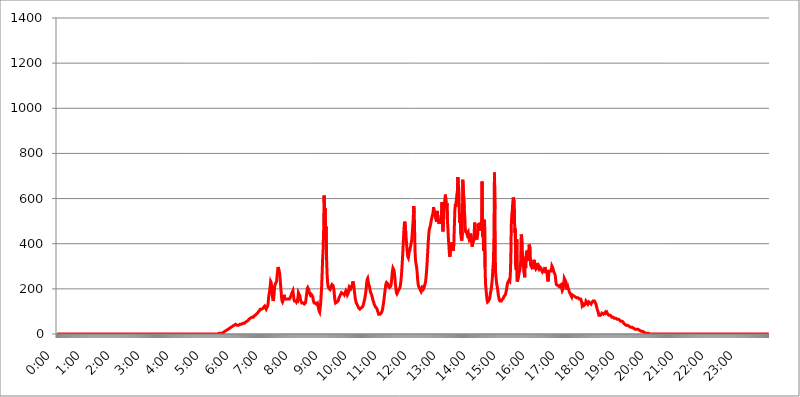
| Category | 2016.05.11. Intenzitás [W/m^2] |
|---|---|
| 0.0 | 0 |
| 0.0006944444444444445 | 0 |
| 0.001388888888888889 | 0 |
| 0.0020833333333333333 | 0 |
| 0.002777777777777778 | 0 |
| 0.003472222222222222 | 0 |
| 0.004166666666666667 | 0 |
| 0.004861111111111111 | 0 |
| 0.005555555555555556 | 0 |
| 0.0062499999999999995 | 0 |
| 0.006944444444444444 | 0 |
| 0.007638888888888889 | 0 |
| 0.008333333333333333 | 0 |
| 0.009027777777777779 | 0 |
| 0.009722222222222222 | 0 |
| 0.010416666666666666 | 0 |
| 0.011111111111111112 | 0 |
| 0.011805555555555555 | 0 |
| 0.012499999999999999 | 0 |
| 0.013194444444444444 | 0 |
| 0.013888888888888888 | 0 |
| 0.014583333333333332 | 0 |
| 0.015277777777777777 | 0 |
| 0.015972222222222224 | 0 |
| 0.016666666666666666 | 0 |
| 0.017361111111111112 | 0 |
| 0.018055555555555557 | 0 |
| 0.01875 | 0 |
| 0.019444444444444445 | 0 |
| 0.02013888888888889 | 0 |
| 0.020833333333333332 | 0 |
| 0.02152777777777778 | 0 |
| 0.022222222222222223 | 0 |
| 0.02291666666666667 | 0 |
| 0.02361111111111111 | 0 |
| 0.024305555555555556 | 0 |
| 0.024999999999999998 | 0 |
| 0.025694444444444447 | 0 |
| 0.02638888888888889 | 0 |
| 0.027083333333333334 | 0 |
| 0.027777777777777776 | 0 |
| 0.02847222222222222 | 0 |
| 0.029166666666666664 | 0 |
| 0.029861111111111113 | 0 |
| 0.030555555555555555 | 0 |
| 0.03125 | 0 |
| 0.03194444444444445 | 0 |
| 0.03263888888888889 | 0 |
| 0.03333333333333333 | 0 |
| 0.034027777777777775 | 0 |
| 0.034722222222222224 | 0 |
| 0.035416666666666666 | 0 |
| 0.036111111111111115 | 0 |
| 0.03680555555555556 | 0 |
| 0.0375 | 0 |
| 0.03819444444444444 | 0 |
| 0.03888888888888889 | 0 |
| 0.03958333333333333 | 0 |
| 0.04027777777777778 | 0 |
| 0.04097222222222222 | 0 |
| 0.041666666666666664 | 0 |
| 0.042361111111111106 | 0 |
| 0.04305555555555556 | 0 |
| 0.043750000000000004 | 0 |
| 0.044444444444444446 | 0 |
| 0.04513888888888889 | 0 |
| 0.04583333333333334 | 0 |
| 0.04652777777777778 | 0 |
| 0.04722222222222222 | 0 |
| 0.04791666666666666 | 0 |
| 0.04861111111111111 | 0 |
| 0.049305555555555554 | 0 |
| 0.049999999999999996 | 0 |
| 0.05069444444444445 | 0 |
| 0.051388888888888894 | 0 |
| 0.052083333333333336 | 0 |
| 0.05277777777777778 | 0 |
| 0.05347222222222222 | 0 |
| 0.05416666666666667 | 0 |
| 0.05486111111111111 | 0 |
| 0.05555555555555555 | 0 |
| 0.05625 | 0 |
| 0.05694444444444444 | 0 |
| 0.057638888888888885 | 0 |
| 0.05833333333333333 | 0 |
| 0.05902777777777778 | 0 |
| 0.059722222222222225 | 0 |
| 0.06041666666666667 | 0 |
| 0.061111111111111116 | 0 |
| 0.06180555555555556 | 0 |
| 0.0625 | 0 |
| 0.06319444444444444 | 0 |
| 0.06388888888888888 | 0 |
| 0.06458333333333334 | 0 |
| 0.06527777777777778 | 0 |
| 0.06597222222222222 | 0 |
| 0.06666666666666667 | 0 |
| 0.06736111111111111 | 0 |
| 0.06805555555555555 | 0 |
| 0.06874999999999999 | 0 |
| 0.06944444444444443 | 0 |
| 0.07013888888888889 | 0 |
| 0.07083333333333333 | 0 |
| 0.07152777777777779 | 0 |
| 0.07222222222222223 | 0 |
| 0.07291666666666667 | 0 |
| 0.07361111111111111 | 0 |
| 0.07430555555555556 | 0 |
| 0.075 | 0 |
| 0.07569444444444444 | 0 |
| 0.0763888888888889 | 0 |
| 0.07708333333333334 | 0 |
| 0.07777777777777778 | 0 |
| 0.07847222222222222 | 0 |
| 0.07916666666666666 | 0 |
| 0.0798611111111111 | 0 |
| 0.08055555555555556 | 0 |
| 0.08125 | 0 |
| 0.08194444444444444 | 0 |
| 0.08263888888888889 | 0 |
| 0.08333333333333333 | 0 |
| 0.08402777777777777 | 0 |
| 0.08472222222222221 | 0 |
| 0.08541666666666665 | 0 |
| 0.08611111111111112 | 0 |
| 0.08680555555555557 | 0 |
| 0.08750000000000001 | 0 |
| 0.08819444444444445 | 0 |
| 0.08888888888888889 | 0 |
| 0.08958333333333333 | 0 |
| 0.09027777777777778 | 0 |
| 0.09097222222222222 | 0 |
| 0.09166666666666667 | 0 |
| 0.09236111111111112 | 0 |
| 0.09305555555555556 | 0 |
| 0.09375 | 0 |
| 0.09444444444444444 | 0 |
| 0.09513888888888888 | 0 |
| 0.09583333333333333 | 0 |
| 0.09652777777777777 | 0 |
| 0.09722222222222222 | 0 |
| 0.09791666666666667 | 0 |
| 0.09861111111111111 | 0 |
| 0.09930555555555555 | 0 |
| 0.09999999999999999 | 0 |
| 0.10069444444444443 | 0 |
| 0.1013888888888889 | 0 |
| 0.10208333333333335 | 0 |
| 0.10277777777777779 | 0 |
| 0.10347222222222223 | 0 |
| 0.10416666666666667 | 0 |
| 0.10486111111111111 | 0 |
| 0.10555555555555556 | 0 |
| 0.10625 | 0 |
| 0.10694444444444444 | 0 |
| 0.1076388888888889 | 0 |
| 0.10833333333333334 | 0 |
| 0.10902777777777778 | 0 |
| 0.10972222222222222 | 0 |
| 0.1111111111111111 | 0 |
| 0.11180555555555556 | 0 |
| 0.11180555555555556 | 0 |
| 0.1125 | 0 |
| 0.11319444444444444 | 0 |
| 0.11388888888888889 | 0 |
| 0.11458333333333333 | 0 |
| 0.11527777777777777 | 0 |
| 0.11597222222222221 | 0 |
| 0.11666666666666665 | 0 |
| 0.1173611111111111 | 0 |
| 0.11805555555555557 | 0 |
| 0.11944444444444445 | 0 |
| 0.12013888888888889 | 0 |
| 0.12083333333333333 | 0 |
| 0.12152777777777778 | 0 |
| 0.12222222222222223 | 0 |
| 0.12291666666666667 | 0 |
| 0.12291666666666667 | 0 |
| 0.12361111111111112 | 0 |
| 0.12430555555555556 | 0 |
| 0.125 | 0 |
| 0.12569444444444444 | 0 |
| 0.12638888888888888 | 0 |
| 0.12708333333333333 | 0 |
| 0.16875 | 0 |
| 0.12847222222222224 | 0 |
| 0.12916666666666668 | 0 |
| 0.12986111111111112 | 0 |
| 0.13055555555555556 | 0 |
| 0.13125 | 0 |
| 0.13194444444444445 | 0 |
| 0.1326388888888889 | 0 |
| 0.13333333333333333 | 0 |
| 0.13402777777777777 | 0 |
| 0.13402777777777777 | 0 |
| 0.13472222222222222 | 0 |
| 0.13541666666666666 | 0 |
| 0.1361111111111111 | 0 |
| 0.13749999999999998 | 0 |
| 0.13819444444444443 | 0 |
| 0.1388888888888889 | 0 |
| 0.13958333333333334 | 0 |
| 0.14027777777777778 | 0 |
| 0.14097222222222222 | 0 |
| 0.14166666666666666 | 0 |
| 0.1423611111111111 | 0 |
| 0.14305555555555557 | 0 |
| 0.14375000000000002 | 0 |
| 0.14444444444444446 | 0 |
| 0.1451388888888889 | 0 |
| 0.1451388888888889 | 0 |
| 0.14652777777777778 | 0 |
| 0.14722222222222223 | 0 |
| 0.14791666666666667 | 0 |
| 0.1486111111111111 | 0 |
| 0.14930555555555555 | 0 |
| 0.15 | 0 |
| 0.15069444444444444 | 0 |
| 0.15138888888888888 | 0 |
| 0.15208333333333332 | 0 |
| 0.15277777777777776 | 0 |
| 0.15347222222222223 | 0 |
| 0.15416666666666667 | 0 |
| 0.15486111111111112 | 0 |
| 0.15555555555555556 | 0 |
| 0.15625 | 0 |
| 0.15694444444444444 | 0 |
| 0.15763888888888888 | 0 |
| 0.15833333333333333 | 0 |
| 0.15902777777777777 | 0 |
| 0.15972222222222224 | 0 |
| 0.16041666666666668 | 0 |
| 0.16111111111111112 | 0 |
| 0.16180555555555556 | 0 |
| 0.1625 | 0 |
| 0.16319444444444445 | 0 |
| 0.1638888888888889 | 0 |
| 0.16458333333333333 | 0 |
| 0.16527777777777777 | 0 |
| 0.16597222222222222 | 0 |
| 0.16666666666666666 | 0 |
| 0.1673611111111111 | 0 |
| 0.16805555555555554 | 0 |
| 0.16874999999999998 | 0 |
| 0.16944444444444443 | 0 |
| 0.17013888888888887 | 0 |
| 0.1708333333333333 | 0 |
| 0.17152777777777775 | 0 |
| 0.17222222222222225 | 0 |
| 0.1729166666666667 | 0 |
| 0.17361111111111113 | 0 |
| 0.17430555555555557 | 0 |
| 0.17500000000000002 | 0 |
| 0.17569444444444446 | 0 |
| 0.1763888888888889 | 0 |
| 0.17708333333333334 | 0 |
| 0.17777777777777778 | 0 |
| 0.17847222222222223 | 0 |
| 0.17916666666666667 | 0 |
| 0.1798611111111111 | 0 |
| 0.18055555555555555 | 0 |
| 0.18125 | 0 |
| 0.18194444444444444 | 0 |
| 0.1826388888888889 | 0 |
| 0.18333333333333335 | 0 |
| 0.1840277777777778 | 0 |
| 0.18472222222222223 | 0 |
| 0.18541666666666667 | 0 |
| 0.18611111111111112 | 0 |
| 0.18680555555555556 | 0 |
| 0.1875 | 0 |
| 0.18819444444444444 | 0 |
| 0.18888888888888888 | 0 |
| 0.18958333333333333 | 0 |
| 0.19027777777777777 | 0 |
| 0.1909722222222222 | 0 |
| 0.19166666666666665 | 0 |
| 0.19236111111111112 | 0 |
| 0.19305555555555554 | 0 |
| 0.19375 | 0 |
| 0.19444444444444445 | 0 |
| 0.1951388888888889 | 0 |
| 0.19583333333333333 | 0 |
| 0.19652777777777777 | 0 |
| 0.19722222222222222 | 0 |
| 0.19791666666666666 | 0 |
| 0.1986111111111111 | 0 |
| 0.19930555555555554 | 0 |
| 0.19999999999999998 | 0 |
| 0.20069444444444443 | 0 |
| 0.20138888888888887 | 0 |
| 0.2020833333333333 | 0 |
| 0.2027777777777778 | 0 |
| 0.2034722222222222 | 0 |
| 0.2041666666666667 | 0 |
| 0.20486111111111113 | 0 |
| 0.20555555555555557 | 0 |
| 0.20625000000000002 | 0 |
| 0.20694444444444446 | 0 |
| 0.2076388888888889 | 0 |
| 0.20833333333333334 | 0 |
| 0.20902777777777778 | 0 |
| 0.20972222222222223 | 0 |
| 0.21041666666666667 | 0 |
| 0.2111111111111111 | 0 |
| 0.21180555555555555 | 0 |
| 0.2125 | 0 |
| 0.21319444444444444 | 0 |
| 0.2138888888888889 | 0 |
| 0.21458333333333335 | 0 |
| 0.2152777777777778 | 0 |
| 0.21597222222222223 | 0 |
| 0.21666666666666667 | 0 |
| 0.21736111111111112 | 0 |
| 0.21805555555555556 | 0 |
| 0.21875 | 0 |
| 0.21944444444444444 | 0 |
| 0.22013888888888888 | 0 |
| 0.22083333333333333 | 0 |
| 0.22152777777777777 | 0 |
| 0.2222222222222222 | 0 |
| 0.22291666666666665 | 0 |
| 0.2236111111111111 | 0 |
| 0.22430555555555556 | 0 |
| 0.225 | 0 |
| 0.22569444444444445 | 3.525 |
| 0.2263888888888889 | 0 |
| 0.22708333333333333 | 3.525 |
| 0.22777777777777777 | 3.525 |
| 0.22847222222222222 | 3.525 |
| 0.22916666666666666 | 3.525 |
| 0.2298611111111111 | 3.525 |
| 0.23055555555555554 | 3.525 |
| 0.23124999999999998 | 3.525 |
| 0.23194444444444443 | 3.525 |
| 0.23263888888888887 | 7.887 |
| 0.2333333333333333 | 7.887 |
| 0.2340277777777778 | 7.887 |
| 0.2347222222222222 | 12.257 |
| 0.2354166666666667 | 12.257 |
| 0.23611111111111113 | 12.257 |
| 0.23680555555555557 | 16.636 |
| 0.23750000000000002 | 16.636 |
| 0.23819444444444446 | 16.636 |
| 0.2388888888888889 | 16.636 |
| 0.23958333333333334 | 21.024 |
| 0.24027777777777778 | 21.024 |
| 0.24097222222222223 | 25.419 |
| 0.24166666666666667 | 25.419 |
| 0.2423611111111111 | 25.419 |
| 0.24305555555555555 | 29.823 |
| 0.24375 | 29.823 |
| 0.24444444444444446 | 34.234 |
| 0.24513888888888888 | 34.234 |
| 0.24583333333333335 | 34.234 |
| 0.2465277777777778 | 38.653 |
| 0.24722222222222223 | 38.653 |
| 0.24791666666666667 | 38.653 |
| 0.24861111111111112 | 38.653 |
| 0.24930555555555556 | 38.653 |
| 0.25 | 43.079 |
| 0.25069444444444444 | 43.079 |
| 0.2513888888888889 | 43.079 |
| 0.2520833333333333 | 38.653 |
| 0.25277777777777777 | 38.653 |
| 0.2534722222222222 | 38.653 |
| 0.25416666666666665 | 38.653 |
| 0.2548611111111111 | 38.653 |
| 0.2555555555555556 | 43.079 |
| 0.25625000000000003 | 43.079 |
| 0.2569444444444445 | 43.079 |
| 0.2576388888888889 | 43.079 |
| 0.25833333333333336 | 43.079 |
| 0.2590277777777778 | 43.079 |
| 0.25972222222222224 | 43.079 |
| 0.2604166666666667 | 47.511 |
| 0.2611111111111111 | 47.511 |
| 0.26180555555555557 | 47.511 |
| 0.2625 | 47.511 |
| 0.26319444444444445 | 47.511 |
| 0.2638888888888889 | 51.951 |
| 0.26458333333333334 | 51.951 |
| 0.2652777777777778 | 51.951 |
| 0.2659722222222222 | 56.398 |
| 0.26666666666666666 | 56.398 |
| 0.2673611111111111 | 56.398 |
| 0.26805555555555555 | 60.85 |
| 0.26875 | 65.31 |
| 0.26944444444444443 | 65.31 |
| 0.2701388888888889 | 65.31 |
| 0.2708333333333333 | 69.775 |
| 0.27152777777777776 | 69.775 |
| 0.2722222222222222 | 69.775 |
| 0.27291666666666664 | 74.246 |
| 0.2736111111111111 | 74.246 |
| 0.2743055555555555 | 74.246 |
| 0.27499999999999997 | 74.246 |
| 0.27569444444444446 | 78.722 |
| 0.27638888888888885 | 78.722 |
| 0.27708333333333335 | 78.722 |
| 0.2777777777777778 | 83.205 |
| 0.27847222222222223 | 83.205 |
| 0.2791666666666667 | 87.692 |
| 0.2798611111111111 | 87.692 |
| 0.28055555555555556 | 92.184 |
| 0.28125 | 92.184 |
| 0.28194444444444444 | 96.682 |
| 0.2826388888888889 | 101.184 |
| 0.2833333333333333 | 101.184 |
| 0.28402777777777777 | 105.69 |
| 0.2847222222222222 | 110.201 |
| 0.28541666666666665 | 110.201 |
| 0.28611111111111115 | 110.201 |
| 0.28680555555555554 | 110.201 |
| 0.28750000000000003 | 110.201 |
| 0.2881944444444445 | 110.201 |
| 0.2888888888888889 | 114.716 |
| 0.28958333333333336 | 119.235 |
| 0.2902777777777778 | 119.235 |
| 0.29097222222222224 | 123.758 |
| 0.2916666666666667 | 119.235 |
| 0.2923611111111111 | 119.235 |
| 0.29305555555555557 | 110.201 |
| 0.29375 | 114.716 |
| 0.29444444444444445 | 119.235 |
| 0.2951388888888889 | 123.758 |
| 0.29583333333333334 | 137.347 |
| 0.2965277777777778 | 164.605 |
| 0.2972222222222222 | 178.264 |
| 0.29791666666666666 | 191.937 |
| 0.2986111111111111 | 210.182 |
| 0.29930555555555555 | 233 |
| 0.3 | 228.436 |
| 0.30069444444444443 | 210.182 |
| 0.3013888888888889 | 178.264 |
| 0.3020833333333333 | 160.056 |
| 0.30277777777777776 | 146.423 |
| 0.3034722222222222 | 155.509 |
| 0.30416666666666664 | 178.264 |
| 0.3048611111111111 | 210.182 |
| 0.3055555555555555 | 219.309 |
| 0.30624999999999997 | 219.309 |
| 0.3069444444444444 | 219.309 |
| 0.3076388888888889 | 233 |
| 0.30833333333333335 | 255.813 |
| 0.3090277777777778 | 278.603 |
| 0.30972222222222223 | 296.808 |
| 0.3104166666666667 | 287.709 |
| 0.3111111111111111 | 283.156 |
| 0.31180555555555556 | 269.49 |
| 0.3125 | 251.251 |
| 0.31319444444444444 | 219.309 |
| 0.3138888888888889 | 191.937 |
| 0.3145833333333333 | 164.605 |
| 0.31527777777777777 | 146.423 |
| 0.3159722222222222 | 141.884 |
| 0.31666666666666665 | 141.884 |
| 0.31736111111111115 | 155.509 |
| 0.31805555555555554 | 173.709 |
| 0.31875000000000003 | 160.056 |
| 0.3194444444444445 | 155.509 |
| 0.3201388888888889 | 155.509 |
| 0.32083333333333336 | 155.509 |
| 0.3215277777777778 | 155.509 |
| 0.32222222222222224 | 155.509 |
| 0.3229166666666667 | 155.509 |
| 0.3236111111111111 | 155.509 |
| 0.32430555555555557 | 155.509 |
| 0.325 | 155.509 |
| 0.32569444444444445 | 155.509 |
| 0.3263888888888889 | 160.056 |
| 0.32708333333333334 | 164.605 |
| 0.3277777777777778 | 164.605 |
| 0.3284722222222222 | 173.709 |
| 0.32916666666666666 | 182.82 |
| 0.3298611111111111 | 187.378 |
| 0.33055555555555555 | 191.937 |
| 0.33125 | 173.709 |
| 0.33194444444444443 | 155.509 |
| 0.3326388888888889 | 146.423 |
| 0.3333333333333333 | 146.423 |
| 0.3340277777777778 | 146.423 |
| 0.3347222222222222 | 146.423 |
| 0.3354166666666667 | 141.884 |
| 0.3361111111111111 | 146.423 |
| 0.3368055555555556 | 137.347 |
| 0.33749999999999997 | 155.509 |
| 0.33819444444444446 | 182.82 |
| 0.33888888888888885 | 178.264 |
| 0.33958333333333335 | 178.264 |
| 0.34027777777777773 | 169.156 |
| 0.34097222222222223 | 155.509 |
| 0.3416666666666666 | 146.423 |
| 0.3423611111111111 | 141.884 |
| 0.3430555555555555 | 137.347 |
| 0.34375 | 137.347 |
| 0.3444444444444445 | 137.347 |
| 0.3451388888888889 | 137.347 |
| 0.3458333333333334 | 137.347 |
| 0.34652777777777777 | 132.814 |
| 0.34722222222222227 | 132.814 |
| 0.34791666666666665 | 137.347 |
| 0.34861111111111115 | 146.423 |
| 0.34930555555555554 | 164.605 |
| 0.35000000000000003 | 182.82 |
| 0.3506944444444444 | 201.058 |
| 0.3513888888888889 | 205.62 |
| 0.3520833333333333 | 201.058 |
| 0.3527777777777778 | 196.497 |
| 0.3534722222222222 | 182.82 |
| 0.3541666666666667 | 178.264 |
| 0.3548611111111111 | 173.709 |
| 0.35555555555555557 | 178.264 |
| 0.35625 | 178.264 |
| 0.35694444444444445 | 173.709 |
| 0.3576388888888889 | 169.156 |
| 0.35833333333333334 | 164.605 |
| 0.3590277777777778 | 150.964 |
| 0.3597222222222222 | 141.884 |
| 0.36041666666666666 | 137.347 |
| 0.3611111111111111 | 137.347 |
| 0.36180555555555555 | 137.347 |
| 0.3625 | 137.347 |
| 0.36319444444444443 | 132.814 |
| 0.3638888888888889 | 132.814 |
| 0.3645833333333333 | 128.284 |
| 0.3652777777777778 | 132.814 |
| 0.3659722222222222 | 123.758 |
| 0.3666666666666667 | 110.201 |
| 0.3673611111111111 | 101.184 |
| 0.3680555555555556 | 96.682 |
| 0.36874999999999997 | 114.716 |
| 0.36944444444444446 | 137.347 |
| 0.37013888888888885 | 173.709 |
| 0.37083333333333335 | 210.182 |
| 0.37152777777777773 | 269.49 |
| 0.37222222222222223 | 333.113 |
| 0.3729166666666666 | 373.729 |
| 0.3736111111111111 | 458.38 |
| 0.3743055555555555 | 613.252 |
| 0.375 | 549.704 |
| 0.3756944444444445 | 558.261 |
| 0.3763888888888889 | 462.786 |
| 0.3770833333333334 | 475.972 |
| 0.37777777777777777 | 328.584 |
| 0.37847222222222227 | 264.932 |
| 0.37916666666666665 | 228.436 |
| 0.37986111111111115 | 210.182 |
| 0.38055555555555554 | 205.62 |
| 0.38125000000000003 | 201.058 |
| 0.3819444444444444 | 201.058 |
| 0.3826388888888889 | 196.497 |
| 0.3833333333333333 | 201.058 |
| 0.3840277777777778 | 210.182 |
| 0.3847222222222222 | 214.746 |
| 0.3854166666666667 | 219.309 |
| 0.3861111111111111 | 219.309 |
| 0.38680555555555557 | 214.746 |
| 0.3875 | 205.62 |
| 0.38819444444444445 | 191.937 |
| 0.3888888888888889 | 164.605 |
| 0.38958333333333334 | 146.423 |
| 0.3902777777777778 | 137.347 |
| 0.3909722222222222 | 137.347 |
| 0.39166666666666666 | 137.347 |
| 0.3923611111111111 | 141.884 |
| 0.39305555555555555 | 141.884 |
| 0.39375 | 146.423 |
| 0.39444444444444443 | 150.964 |
| 0.3951388888888889 | 160.056 |
| 0.3958333333333333 | 164.605 |
| 0.3965277777777778 | 169.156 |
| 0.3972222222222222 | 173.709 |
| 0.3979166666666667 | 178.264 |
| 0.3986111111111111 | 182.82 |
| 0.3993055555555556 | 182.82 |
| 0.39999999999999997 | 178.264 |
| 0.40069444444444446 | 178.264 |
| 0.40138888888888885 | 178.264 |
| 0.40208333333333335 | 178.264 |
| 0.40277777777777773 | 173.709 |
| 0.40347222222222223 | 178.264 |
| 0.4041666666666666 | 187.378 |
| 0.4048611111111111 | 191.937 |
| 0.4055555555555555 | 187.378 |
| 0.40625 | 182.82 |
| 0.4069444444444445 | 173.709 |
| 0.4076388888888889 | 173.709 |
| 0.4083333333333334 | 182.82 |
| 0.40902777777777777 | 201.058 |
| 0.40972222222222227 | 210.182 |
| 0.41041666666666665 | 210.182 |
| 0.41111111111111115 | 205.62 |
| 0.41180555555555554 | 201.058 |
| 0.41250000000000003 | 205.62 |
| 0.4131944444444444 | 210.182 |
| 0.4138888888888889 | 219.309 |
| 0.4145833333333333 | 233 |
| 0.4152777777777778 | 233 |
| 0.4159722222222222 | 214.746 |
| 0.4166666666666667 | 191.937 |
| 0.4173611111111111 | 173.709 |
| 0.41805555555555557 | 155.509 |
| 0.41875 | 146.423 |
| 0.41944444444444445 | 137.347 |
| 0.4201388888888889 | 132.814 |
| 0.42083333333333334 | 128.284 |
| 0.4215277777777778 | 123.758 |
| 0.4222222222222222 | 119.235 |
| 0.42291666666666666 | 114.716 |
| 0.4236111111111111 | 114.716 |
| 0.42430555555555555 | 110.201 |
| 0.425 | 110.201 |
| 0.42569444444444443 | 114.716 |
| 0.4263888888888889 | 114.716 |
| 0.4270833333333333 | 114.716 |
| 0.4277777777777778 | 119.235 |
| 0.4284722222222222 | 123.758 |
| 0.4291666666666667 | 128.284 |
| 0.4298611111111111 | 137.347 |
| 0.4305555555555556 | 146.423 |
| 0.43124999999999997 | 155.509 |
| 0.43194444444444446 | 169.156 |
| 0.43263888888888885 | 182.82 |
| 0.43333333333333335 | 201.058 |
| 0.43402777777777773 | 228.436 |
| 0.43472222222222223 | 242.127 |
| 0.4354166666666666 | 246.689 |
| 0.4361111111111111 | 233 |
| 0.4368055555555555 | 219.309 |
| 0.4375 | 214.746 |
| 0.4381944444444445 | 205.62 |
| 0.4388888888888889 | 191.937 |
| 0.4395833333333334 | 182.82 |
| 0.44027777777777777 | 178.264 |
| 0.44097222222222227 | 173.709 |
| 0.44166666666666665 | 164.605 |
| 0.44236111111111115 | 155.509 |
| 0.44305555555555554 | 146.423 |
| 0.44375000000000003 | 141.884 |
| 0.4444444444444444 | 132.814 |
| 0.4451388888888889 | 128.284 |
| 0.4458333333333333 | 128.284 |
| 0.4465277777777778 | 119.235 |
| 0.4472222222222222 | 119.235 |
| 0.4479166666666667 | 114.716 |
| 0.4486111111111111 | 110.201 |
| 0.44930555555555557 | 101.184 |
| 0.45 | 96.682 |
| 0.45069444444444445 | 87.692 |
| 0.4513888888888889 | 87.692 |
| 0.45208333333333334 | 87.692 |
| 0.4527777777777778 | 87.692 |
| 0.4534722222222222 | 87.692 |
| 0.45416666666666666 | 92.184 |
| 0.4548611111111111 | 96.682 |
| 0.45555555555555555 | 101.184 |
| 0.45625 | 110.201 |
| 0.45694444444444443 | 123.758 |
| 0.4576388888888889 | 137.347 |
| 0.4583333333333333 | 155.509 |
| 0.4590277777777778 | 173.709 |
| 0.4597222222222222 | 191.937 |
| 0.4604166666666667 | 210.182 |
| 0.4611111111111111 | 223.873 |
| 0.4618055555555556 | 228.436 |
| 0.46249999999999997 | 228.436 |
| 0.46319444444444446 | 223.873 |
| 0.46388888888888885 | 219.309 |
| 0.46458333333333335 | 210.182 |
| 0.46527777777777773 | 210.182 |
| 0.46597222222222223 | 205.62 |
| 0.4666666666666666 | 205.62 |
| 0.4673611111111111 | 210.182 |
| 0.4680555555555555 | 214.746 |
| 0.46875 | 233 |
| 0.4694444444444445 | 255.813 |
| 0.4701388888888889 | 278.603 |
| 0.4708333333333334 | 292.259 |
| 0.47152777777777777 | 292.259 |
| 0.47222222222222227 | 283.156 |
| 0.47291666666666665 | 269.49 |
| 0.47361111111111115 | 246.689 |
| 0.47430555555555554 | 219.309 |
| 0.47500000000000003 | 201.058 |
| 0.4756944444444444 | 182.82 |
| 0.4763888888888889 | 178.264 |
| 0.4770833333333333 | 178.264 |
| 0.4777777777777778 | 187.378 |
| 0.4784722222222222 | 191.937 |
| 0.4791666666666667 | 196.497 |
| 0.4798611111111111 | 201.058 |
| 0.48055555555555557 | 205.62 |
| 0.48125 | 214.746 |
| 0.48194444444444445 | 233 |
| 0.4826388888888889 | 255.813 |
| 0.48333333333333334 | 287.709 |
| 0.4840277777777778 | 324.052 |
| 0.4847222222222222 | 364.728 |
| 0.48541666666666666 | 409.574 |
| 0.4861111111111111 | 453.968 |
| 0.48680555555555555 | 489.108 |
| 0.4875 | 497.836 |
| 0.48819444444444443 | 497.836 |
| 0.4888888888888889 | 445.129 |
| 0.4895833333333333 | 414.035 |
| 0.4902777777777778 | 387.202 |
| 0.4909722222222222 | 360.221 |
| 0.4916666666666667 | 342.162 |
| 0.4923611111111111 | 337.639 |
| 0.4930555555555556 | 351.198 |
| 0.49374999999999997 | 364.728 |
| 0.49444444444444446 | 369.23 |
| 0.49513888888888885 | 382.715 |
| 0.49583333333333335 | 391.685 |
| 0.49652777777777773 | 405.108 |
| 0.49722222222222223 | 418.492 |
| 0.4979166666666666 | 445.129 |
| 0.4986111111111111 | 480.356 |
| 0.4993055555555555 | 510.885 |
| 0.5 | 566.793 |
| 0.5006944444444444 | 536.82 |
| 0.5013888888888889 | 427.39 |
| 0.5020833333333333 | 342.162 |
| 0.5027777777777778 | 319.517 |
| 0.5034722222222222 | 305.898 |
| 0.5041666666666667 | 292.259 |
| 0.5048611111111111 | 269.49 |
| 0.5055555555555555 | 237.564 |
| 0.50625 | 219.309 |
| 0.5069444444444444 | 210.182 |
| 0.5076388888888889 | 205.62 |
| 0.5083333333333333 | 201.058 |
| 0.5090277777777777 | 196.497 |
| 0.5097222222222222 | 191.937 |
| 0.5104166666666666 | 187.378 |
| 0.5111111111111112 | 191.937 |
| 0.5118055555555555 | 205.62 |
| 0.5125000000000001 | 214.746 |
| 0.5131944444444444 | 205.62 |
| 0.513888888888889 | 201.058 |
| 0.5145833333333333 | 205.62 |
| 0.5152777777777778 | 214.746 |
| 0.5159722222222222 | 223.873 |
| 0.5166666666666667 | 233 |
| 0.517361111111111 | 255.813 |
| 0.5180555555555556 | 283.156 |
| 0.5187499999999999 | 314.98 |
| 0.5194444444444445 | 355.712 |
| 0.5201388888888888 | 396.164 |
| 0.5208333333333334 | 431.833 |
| 0.5215277777777778 | 458.38 |
| 0.5222222222222223 | 467.187 |
| 0.5229166666666667 | 475.972 |
| 0.5236111111111111 | 484.735 |
| 0.5243055555555556 | 497.836 |
| 0.525 | 510.885 |
| 0.5256944444444445 | 515.223 |
| 0.5263888888888889 | 515.223 |
| 0.5270833333333333 | 536.82 |
| 0.5277777777777778 | 562.53 |
| 0.5284722222222222 | 545.416 |
| 0.5291666666666667 | 532.513 |
| 0.5298611111111111 | 523.88 |
| 0.5305555555555556 | 515.223 |
| 0.53125 | 519.555 |
| 0.5319444444444444 | 497.836 |
| 0.5326388888888889 | 545.416 |
| 0.5333333333333333 | 545.416 |
| 0.5340277777777778 | 515.223 |
| 0.5347222222222222 | 497.836 |
| 0.5354166666666667 | 489.108 |
| 0.5361111111111111 | 497.836 |
| 0.5368055555555555 | 489.108 |
| 0.5375 | 497.836 |
| 0.5381944444444444 | 510.885 |
| 0.5388888888888889 | 532.513 |
| 0.5395833333333333 | 583.779 |
| 0.5402777777777777 | 493.475 |
| 0.5409722222222222 | 453.968 |
| 0.5416666666666666 | 519.555 |
| 0.5423611111111112 | 553.986 |
| 0.5430555555555555 | 579.542 |
| 0.5437500000000001 | 583.779 |
| 0.5444444444444444 | 617.436 |
| 0.545138888888889 | 613.252 |
| 0.5458333333333333 | 558.261 |
| 0.5465277777777778 | 579.542 |
| 0.5472222222222222 | 502.192 |
| 0.5479166666666667 | 467.187 |
| 0.548611111111111 | 422.943 |
| 0.5493055555555556 | 391.685 |
| 0.5499999999999999 | 355.712 |
| 0.5506944444444445 | 342.162 |
| 0.5513888888888888 | 373.729 |
| 0.5520833333333334 | 405.108 |
| 0.5527777777777778 | 405.108 |
| 0.5534722222222223 | 387.202 |
| 0.5541666666666667 | 378.224 |
| 0.5548611111111111 | 378.224 |
| 0.5555555555555556 | 369.23 |
| 0.55625 | 405.108 |
| 0.5569444444444445 | 475.972 |
| 0.5576388888888889 | 545.416 |
| 0.5583333333333333 | 575.299 |
| 0.5590277777777778 | 562.53 |
| 0.5597222222222222 | 588.009 |
| 0.5604166666666667 | 617.436 |
| 0.5611111111111111 | 625.784 |
| 0.5618055555555556 | 695.666 |
| 0.5625 | 667.123 |
| 0.5631944444444444 | 642.4 |
| 0.5638888888888889 | 545.416 |
| 0.5645833333333333 | 493.475 |
| 0.5652777777777778 | 519.555 |
| 0.5659722222222222 | 445.129 |
| 0.5666666666666667 | 422.943 |
| 0.5673611111111111 | 414.035 |
| 0.5680555555555555 | 449.551 |
| 0.56875 | 683.473 |
| 0.5694444444444444 | 687.544 |
| 0.5701388888888889 | 679.395 |
| 0.5708333333333333 | 558.261 |
| 0.5715277777777777 | 523.88 |
| 0.5722222222222222 | 467.187 |
| 0.5729166666666666 | 449.551 |
| 0.5736111111111112 | 458.38 |
| 0.5743055555555555 | 453.968 |
| 0.5750000000000001 | 440.702 |
| 0.5756944444444444 | 440.702 |
| 0.576388888888889 | 449.551 |
| 0.5770833333333333 | 427.39 |
| 0.5777777777777778 | 418.492 |
| 0.5784722222222222 | 418.492 |
| 0.5791666666666667 | 427.39 |
| 0.579861111111111 | 445.129 |
| 0.5805555555555556 | 449.551 |
| 0.5812499999999999 | 405.108 |
| 0.5819444444444445 | 387.202 |
| 0.5826388888888888 | 400.638 |
| 0.5833333333333334 | 405.108 |
| 0.5840277777777778 | 414.035 |
| 0.5847222222222223 | 440.702 |
| 0.5854166666666667 | 493.475 |
| 0.5861111111111111 | 440.702 |
| 0.5868055555555556 | 431.833 |
| 0.5875 | 436.27 |
| 0.5881944444444445 | 418.492 |
| 0.5888888888888889 | 427.39 |
| 0.5895833333333333 | 436.27 |
| 0.5902777777777778 | 489.108 |
| 0.5909722222222222 | 458.38 |
| 0.5916666666666667 | 458.38 |
| 0.5923611111111111 | 471.582 |
| 0.5930555555555556 | 493.475 |
| 0.59375 | 458.38 |
| 0.5944444444444444 | 471.582 |
| 0.5951388888888889 | 502.192 |
| 0.5958333333333333 | 675.311 |
| 0.5965277777777778 | 431.833 |
| 0.5972222222222222 | 506.542 |
| 0.5979166666666667 | 369.23 |
| 0.5986111111111111 | 378.224 |
| 0.5993055555555555 | 506.542 |
| 0.6 | 296.808 |
| 0.6006944444444444 | 223.873 |
| 0.6013888888888889 | 196.497 |
| 0.6020833333333333 | 173.709 |
| 0.6027777777777777 | 150.964 |
| 0.6034722222222222 | 141.884 |
| 0.6041666666666666 | 141.884 |
| 0.6048611111111112 | 146.423 |
| 0.6055555555555555 | 146.423 |
| 0.6062500000000001 | 155.509 |
| 0.6069444444444444 | 164.605 |
| 0.607638888888889 | 182.82 |
| 0.6083333333333333 | 191.937 |
| 0.6090277777777778 | 210.182 |
| 0.6097222222222222 | 228.436 |
| 0.6104166666666667 | 255.813 |
| 0.611111111111111 | 296.808 |
| 0.6118055555555556 | 324.052 |
| 0.6124999999999999 | 440.702 |
| 0.6131944444444445 | 715.858 |
| 0.6138888888888888 | 553.986 |
| 0.6145833333333334 | 278.603 |
| 0.6152777777777778 | 255.813 |
| 0.6159722222222223 | 233 |
| 0.6166666666666667 | 214.746 |
| 0.6173611111111111 | 205.62 |
| 0.6180555555555556 | 187.378 |
| 0.61875 | 169.156 |
| 0.6194444444444445 | 160.056 |
| 0.6201388888888889 | 150.964 |
| 0.6208333333333333 | 146.423 |
| 0.6215277777777778 | 146.423 |
| 0.6222222222222222 | 146.423 |
| 0.6229166666666667 | 146.423 |
| 0.6236111111111111 | 150.964 |
| 0.6243055555555556 | 150.964 |
| 0.625 | 155.509 |
| 0.6256944444444444 | 160.056 |
| 0.6263888888888889 | 164.605 |
| 0.6270833333333333 | 169.156 |
| 0.6277777777777778 | 169.156 |
| 0.6284722222222222 | 173.709 |
| 0.6291666666666667 | 182.82 |
| 0.6298611111111111 | 191.937 |
| 0.6305555555555555 | 205.62 |
| 0.63125 | 219.309 |
| 0.6319444444444444 | 228.436 |
| 0.6326388888888889 | 233 |
| 0.6333333333333333 | 237.564 |
| 0.6340277777777777 | 237.564 |
| 0.6347222222222222 | 233 |
| 0.6354166666666666 | 260.373 |
| 0.6361111111111112 | 333.113 |
| 0.6368055555555555 | 480.356 |
| 0.6375000000000001 | 528.2 |
| 0.6381944444444444 | 545.416 |
| 0.638888888888889 | 583.779 |
| 0.6395833333333333 | 604.864 |
| 0.6402777777777778 | 596.45 |
| 0.6409722222222222 | 588.009 |
| 0.6416666666666667 | 449.551 |
| 0.642361111111111 | 467.187 |
| 0.6430555555555556 | 301.354 |
| 0.6437499999999999 | 283.156 |
| 0.6444444444444445 | 418.492 |
| 0.6451388888888888 | 233 |
| 0.6458333333333334 | 237.564 |
| 0.6465277777777778 | 246.689 |
| 0.6472222222222223 | 260.373 |
| 0.6479166666666667 | 274.047 |
| 0.6486111111111111 | 278.603 |
| 0.6493055555555556 | 292.259 |
| 0.65 | 324.052 |
| 0.6506944444444445 | 440.702 |
| 0.6513888888888889 | 431.833 |
| 0.6520833333333333 | 405.108 |
| 0.6527777777777778 | 301.354 |
| 0.6534722222222222 | 301.354 |
| 0.6541666666666667 | 310.44 |
| 0.6548611111111111 | 269.49 |
| 0.6555555555555556 | 251.251 |
| 0.65625 | 337.639 |
| 0.6569444444444444 | 292.259 |
| 0.6576388888888889 | 346.682 |
| 0.6583333333333333 | 364.728 |
| 0.6590277777777778 | 369.23 |
| 0.6597222222222222 | 324.052 |
| 0.6604166666666667 | 351.198 |
| 0.6611111111111111 | 355.712 |
| 0.6618055555555555 | 396.164 |
| 0.6625 | 396.164 |
| 0.6631944444444444 | 378.224 |
| 0.6638888888888889 | 305.898 |
| 0.6645833333333333 | 301.354 |
| 0.6652777777777777 | 296.808 |
| 0.6659722222222222 | 301.354 |
| 0.6666666666666666 | 305.898 |
| 0.6673611111111111 | 296.808 |
| 0.6680555555555556 | 287.709 |
| 0.6687500000000001 | 328.584 |
| 0.6694444444444444 | 296.808 |
| 0.6701388888888888 | 287.709 |
| 0.6708333333333334 | 296.808 |
| 0.6715277777777778 | 287.709 |
| 0.6722222222222222 | 287.709 |
| 0.6729166666666666 | 292.259 |
| 0.6736111111111112 | 314.98 |
| 0.6743055555555556 | 314.98 |
| 0.6749999999999999 | 292.259 |
| 0.6756944444444444 | 287.709 |
| 0.6763888888888889 | 287.709 |
| 0.6770833333333334 | 296.808 |
| 0.6777777777777777 | 296.808 |
| 0.6784722222222223 | 292.259 |
| 0.6791666666666667 | 283.156 |
| 0.6798611111111111 | 278.603 |
| 0.6805555555555555 | 274.047 |
| 0.68125 | 274.047 |
| 0.6819444444444445 | 274.047 |
| 0.6826388888888889 | 283.156 |
| 0.6833333333333332 | 287.709 |
| 0.6840277777777778 | 296.808 |
| 0.6847222222222222 | 283.156 |
| 0.6854166666666667 | 269.49 |
| 0.686111111111111 | 283.156 |
| 0.6868055555555556 | 274.047 |
| 0.6875 | 251.251 |
| 0.6881944444444444 | 233 |
| 0.688888888888889 | 242.127 |
| 0.6895833333333333 | 274.047 |
| 0.6902777777777778 | 278.603 |
| 0.6909722222222222 | 278.603 |
| 0.6916666666666668 | 278.603 |
| 0.6923611111111111 | 278.603 |
| 0.6930555555555555 | 283.156 |
| 0.69375 | 301.354 |
| 0.6944444444444445 | 301.354 |
| 0.6951388888888889 | 292.259 |
| 0.6958333333333333 | 283.156 |
| 0.6965277777777777 | 274.047 |
| 0.6972222222222223 | 269.49 |
| 0.6979166666666666 | 264.932 |
| 0.6986111111111111 | 255.813 |
| 0.6993055555555556 | 233 |
| 0.7000000000000001 | 219.309 |
| 0.7006944444444444 | 219.309 |
| 0.7013888888888888 | 219.309 |
| 0.7020833333333334 | 214.746 |
| 0.7027777777777778 | 214.746 |
| 0.7034722222222222 | 214.746 |
| 0.7041666666666666 | 210.182 |
| 0.7048611111111112 | 214.746 |
| 0.7055555555555556 | 214.746 |
| 0.7062499999999999 | 214.746 |
| 0.7069444444444444 | 219.309 |
| 0.7076388888888889 | 201.058 |
| 0.7083333333333334 | 191.937 |
| 0.7090277777777777 | 196.497 |
| 0.7097222222222223 | 205.62 |
| 0.7104166666666667 | 219.309 |
| 0.7111111111111111 | 246.689 |
| 0.7118055555555555 | 242.127 |
| 0.7125 | 237.564 |
| 0.7131944444444445 | 233 |
| 0.7138888888888889 | 223.873 |
| 0.7145833333333332 | 196.497 |
| 0.7152777777777778 | 205.62 |
| 0.7159722222222222 | 210.182 |
| 0.7166666666666667 | 201.058 |
| 0.717361111111111 | 196.497 |
| 0.7180555555555556 | 187.378 |
| 0.71875 | 182.82 |
| 0.7194444444444444 | 178.264 |
| 0.720138888888889 | 178.264 |
| 0.7208333333333333 | 169.156 |
| 0.7215277777777778 | 164.605 |
| 0.7222222222222222 | 173.709 |
| 0.7229166666666668 | 173.709 |
| 0.7236111111111111 | 173.709 |
| 0.7243055555555555 | 169.156 |
| 0.725 | 169.156 |
| 0.7256944444444445 | 169.156 |
| 0.7263888888888889 | 164.605 |
| 0.7270833333333333 | 164.605 |
| 0.7277777777777777 | 164.605 |
| 0.7284722222222223 | 160.056 |
| 0.7291666666666666 | 160.056 |
| 0.7298611111111111 | 160.056 |
| 0.7305555555555556 | 160.056 |
| 0.7312500000000001 | 160.056 |
| 0.7319444444444444 | 155.509 |
| 0.7326388888888888 | 155.509 |
| 0.7333333333333334 | 155.509 |
| 0.7340277777777778 | 155.509 |
| 0.7347222222222222 | 150.964 |
| 0.7354166666666666 | 141.884 |
| 0.7361111111111112 | 128.284 |
| 0.7368055555555556 | 132.814 |
| 0.7374999999999999 | 128.284 |
| 0.7381944444444444 | 132.814 |
| 0.7388888888888889 | 132.814 |
| 0.7395833333333334 | 128.284 |
| 0.7402777777777777 | 128.284 |
| 0.7409722222222223 | 132.814 |
| 0.7416666666666667 | 146.423 |
| 0.7423611111111111 | 146.423 |
| 0.7430555555555555 | 141.884 |
| 0.74375 | 141.884 |
| 0.7444444444444445 | 132.814 |
| 0.7451388888888889 | 132.814 |
| 0.7458333333333332 | 141.884 |
| 0.7465277777777778 | 141.884 |
| 0.7472222222222222 | 137.347 |
| 0.7479166666666667 | 137.347 |
| 0.748611111111111 | 132.814 |
| 0.7493055555555556 | 137.347 |
| 0.75 | 137.347 |
| 0.7506944444444444 | 141.884 |
| 0.751388888888889 | 146.423 |
| 0.7520833333333333 | 146.423 |
| 0.7527777777777778 | 146.423 |
| 0.7534722222222222 | 146.423 |
| 0.7541666666666668 | 141.884 |
| 0.7548611111111111 | 137.347 |
| 0.7555555555555555 | 132.814 |
| 0.75625 | 123.758 |
| 0.7569444444444445 | 114.716 |
| 0.7576388888888889 | 105.69 |
| 0.7583333333333333 | 101.184 |
| 0.7590277777777777 | 92.184 |
| 0.7597222222222223 | 83.205 |
| 0.7604166666666666 | 83.205 |
| 0.7611111111111111 | 83.205 |
| 0.7618055555555556 | 83.205 |
| 0.7625000000000001 | 83.205 |
| 0.7631944444444444 | 87.692 |
| 0.7638888888888888 | 92.184 |
| 0.7645833333333334 | 92.184 |
| 0.7652777777777778 | 92.184 |
| 0.7659722222222222 | 87.692 |
| 0.7666666666666666 | 87.692 |
| 0.7673611111111112 | 92.184 |
| 0.7680555555555556 | 92.184 |
| 0.7687499999999999 | 96.682 |
| 0.7694444444444444 | 92.184 |
| 0.7701388888888889 | 92.184 |
| 0.7708333333333334 | 96.682 |
| 0.7715277777777777 | 92.184 |
| 0.7722222222222223 | 87.692 |
| 0.7729166666666667 | 87.692 |
| 0.7736111111111111 | 83.205 |
| 0.7743055555555555 | 83.205 |
| 0.775 | 83.205 |
| 0.7756944444444445 | 83.205 |
| 0.7763888888888889 | 83.205 |
| 0.7770833333333332 | 78.722 |
| 0.7777777777777778 | 74.246 |
| 0.7784722222222222 | 74.246 |
| 0.7791666666666667 | 74.246 |
| 0.779861111111111 | 74.246 |
| 0.7805555555555556 | 74.246 |
| 0.78125 | 69.775 |
| 0.7819444444444444 | 69.775 |
| 0.782638888888889 | 69.775 |
| 0.7833333333333333 | 69.775 |
| 0.7840277777777778 | 69.775 |
| 0.7847222222222222 | 69.775 |
| 0.7854166666666668 | 65.31 |
| 0.7861111111111111 | 65.31 |
| 0.7868055555555555 | 65.31 |
| 0.7875 | 65.31 |
| 0.7881944444444445 | 65.31 |
| 0.7888888888888889 | 60.85 |
| 0.7895833333333333 | 60.85 |
| 0.7902777777777777 | 56.398 |
| 0.7909722222222223 | 56.398 |
| 0.7916666666666666 | 56.398 |
| 0.7923611111111111 | 56.398 |
| 0.7930555555555556 | 56.398 |
| 0.7937500000000001 | 51.951 |
| 0.7944444444444444 | 47.511 |
| 0.7951388888888888 | 47.511 |
| 0.7958333333333334 | 43.079 |
| 0.7965277777777778 | 43.079 |
| 0.7972222222222222 | 38.653 |
| 0.7979166666666666 | 38.653 |
| 0.7986111111111112 | 38.653 |
| 0.7993055555555556 | 38.653 |
| 0.7999999999999999 | 38.653 |
| 0.8006944444444444 | 38.653 |
| 0.8013888888888889 | 34.234 |
| 0.8020833333333334 | 34.234 |
| 0.8027777777777777 | 34.234 |
| 0.8034722222222223 | 29.823 |
| 0.8041666666666667 | 29.823 |
| 0.8048611111111111 | 29.823 |
| 0.8055555555555555 | 29.823 |
| 0.80625 | 29.823 |
| 0.8069444444444445 | 29.823 |
| 0.8076388888888889 | 25.419 |
| 0.8083333333333332 | 25.419 |
| 0.8090277777777778 | 25.419 |
| 0.8097222222222222 | 25.419 |
| 0.8104166666666667 | 21.024 |
| 0.811111111111111 | 25.419 |
| 0.8118055555555556 | 25.419 |
| 0.8125 | 21.024 |
| 0.8131944444444444 | 21.024 |
| 0.813888888888889 | 21.024 |
| 0.8145833333333333 | 21.024 |
| 0.8152777777777778 | 21.024 |
| 0.8159722222222222 | 16.636 |
| 0.8166666666666668 | 16.636 |
| 0.8173611111111111 | 16.636 |
| 0.8180555555555555 | 16.636 |
| 0.81875 | 12.257 |
| 0.8194444444444445 | 12.257 |
| 0.8201388888888889 | 12.257 |
| 0.8208333333333333 | 12.257 |
| 0.8215277777777777 | 12.257 |
| 0.8222222222222223 | 7.887 |
| 0.8229166666666666 | 7.887 |
| 0.8236111111111111 | 7.887 |
| 0.8243055555555556 | 7.887 |
| 0.8250000000000001 | 3.525 |
| 0.8256944444444444 | 3.525 |
| 0.8263888888888888 | 3.525 |
| 0.8270833333333334 | 3.525 |
| 0.8277777777777778 | 3.525 |
| 0.8284722222222222 | 3.525 |
| 0.8291666666666666 | 3.525 |
| 0.8298611111111112 | 0 |
| 0.8305555555555556 | 3.525 |
| 0.8312499999999999 | 0 |
| 0.8319444444444444 | 0 |
| 0.8326388888888889 | 0 |
| 0.8333333333333334 | 0 |
| 0.8340277777777777 | 0 |
| 0.8347222222222223 | 0 |
| 0.8354166666666667 | 0 |
| 0.8361111111111111 | 0 |
| 0.8368055555555555 | 0 |
| 0.8375 | 0 |
| 0.8381944444444445 | 0 |
| 0.8388888888888889 | 0 |
| 0.8395833333333332 | 0 |
| 0.8402777777777778 | 0 |
| 0.8409722222222222 | 0 |
| 0.8416666666666667 | 0 |
| 0.842361111111111 | 0 |
| 0.8430555555555556 | 0 |
| 0.84375 | 0 |
| 0.8444444444444444 | 0 |
| 0.845138888888889 | 0 |
| 0.8458333333333333 | 0 |
| 0.8465277777777778 | 0 |
| 0.8472222222222222 | 0 |
| 0.8479166666666668 | 0 |
| 0.8486111111111111 | 0 |
| 0.8493055555555555 | 0 |
| 0.85 | 0 |
| 0.8506944444444445 | 0 |
| 0.8513888888888889 | 0 |
| 0.8520833333333333 | 0 |
| 0.8527777777777777 | 0 |
| 0.8534722222222223 | 0 |
| 0.8541666666666666 | 0 |
| 0.8548611111111111 | 0 |
| 0.8555555555555556 | 0 |
| 0.8562500000000001 | 0 |
| 0.8569444444444444 | 0 |
| 0.8576388888888888 | 0 |
| 0.8583333333333334 | 0 |
| 0.8590277777777778 | 0 |
| 0.8597222222222222 | 0 |
| 0.8604166666666666 | 0 |
| 0.8611111111111112 | 0 |
| 0.8618055555555556 | 0 |
| 0.8624999999999999 | 0 |
| 0.8631944444444444 | 0 |
| 0.8638888888888889 | 0 |
| 0.8645833333333334 | 0 |
| 0.8652777777777777 | 0 |
| 0.8659722222222223 | 0 |
| 0.8666666666666667 | 0 |
| 0.8673611111111111 | 0 |
| 0.8680555555555555 | 0 |
| 0.86875 | 0 |
| 0.8694444444444445 | 0 |
| 0.8701388888888889 | 0 |
| 0.8708333333333332 | 0 |
| 0.8715277777777778 | 0 |
| 0.8722222222222222 | 0 |
| 0.8729166666666667 | 0 |
| 0.873611111111111 | 0 |
| 0.8743055555555556 | 0 |
| 0.875 | 0 |
| 0.8756944444444444 | 0 |
| 0.876388888888889 | 0 |
| 0.8770833333333333 | 0 |
| 0.8777777777777778 | 0 |
| 0.8784722222222222 | 0 |
| 0.8791666666666668 | 0 |
| 0.8798611111111111 | 0 |
| 0.8805555555555555 | 0 |
| 0.88125 | 0 |
| 0.8819444444444445 | 0 |
| 0.8826388888888889 | 0 |
| 0.8833333333333333 | 0 |
| 0.8840277777777777 | 0 |
| 0.8847222222222223 | 0 |
| 0.8854166666666666 | 0 |
| 0.8861111111111111 | 0 |
| 0.8868055555555556 | 0 |
| 0.8875000000000001 | 0 |
| 0.8881944444444444 | 0 |
| 0.8888888888888888 | 0 |
| 0.8895833333333334 | 0 |
| 0.8902777777777778 | 0 |
| 0.8909722222222222 | 0 |
| 0.8916666666666666 | 0 |
| 0.8923611111111112 | 0 |
| 0.8930555555555556 | 0 |
| 0.8937499999999999 | 0 |
| 0.8944444444444444 | 0 |
| 0.8951388888888889 | 0 |
| 0.8958333333333334 | 0 |
| 0.8965277777777777 | 0 |
| 0.8972222222222223 | 0 |
| 0.8979166666666667 | 0 |
| 0.8986111111111111 | 0 |
| 0.8993055555555555 | 0 |
| 0.9 | 0 |
| 0.9006944444444445 | 0 |
| 0.9013888888888889 | 0 |
| 0.9020833333333332 | 0 |
| 0.9027777777777778 | 0 |
| 0.9034722222222222 | 0 |
| 0.9041666666666667 | 0 |
| 0.904861111111111 | 0 |
| 0.9055555555555556 | 0 |
| 0.90625 | 0 |
| 0.9069444444444444 | 0 |
| 0.907638888888889 | 0 |
| 0.9083333333333333 | 0 |
| 0.9090277777777778 | 0 |
| 0.9097222222222222 | 0 |
| 0.9104166666666668 | 0 |
| 0.9111111111111111 | 0 |
| 0.9118055555555555 | 0 |
| 0.9125 | 0 |
| 0.9131944444444445 | 0 |
| 0.9138888888888889 | 0 |
| 0.9145833333333333 | 0 |
| 0.9152777777777777 | 0 |
| 0.9159722222222223 | 0 |
| 0.9166666666666666 | 0 |
| 0.9173611111111111 | 0 |
| 0.9180555555555556 | 0 |
| 0.9187500000000001 | 0 |
| 0.9194444444444444 | 0 |
| 0.9201388888888888 | 0 |
| 0.9208333333333334 | 0 |
| 0.9215277777777778 | 0 |
| 0.9222222222222222 | 0 |
| 0.9229166666666666 | 0 |
| 0.9236111111111112 | 0 |
| 0.9243055555555556 | 0 |
| 0.9249999999999999 | 0 |
| 0.9256944444444444 | 0 |
| 0.9263888888888889 | 0 |
| 0.9270833333333334 | 0 |
| 0.9277777777777777 | 0 |
| 0.9284722222222223 | 0 |
| 0.9291666666666667 | 0 |
| 0.9298611111111111 | 0 |
| 0.9305555555555555 | 0 |
| 0.93125 | 0 |
| 0.9319444444444445 | 0 |
| 0.9326388888888889 | 0 |
| 0.9333333333333332 | 0 |
| 0.9340277777777778 | 0 |
| 0.9347222222222222 | 0 |
| 0.9354166666666667 | 0 |
| 0.936111111111111 | 0 |
| 0.9368055555555556 | 0 |
| 0.9375 | 0 |
| 0.9381944444444444 | 0 |
| 0.938888888888889 | 0 |
| 0.9395833333333333 | 0 |
| 0.9402777777777778 | 0 |
| 0.9409722222222222 | 0 |
| 0.9416666666666668 | 0 |
| 0.9423611111111111 | 0 |
| 0.9430555555555555 | 0 |
| 0.94375 | 0 |
| 0.9444444444444445 | 0 |
| 0.9451388888888889 | 0 |
| 0.9458333333333333 | 0 |
| 0.9465277777777777 | 0 |
| 0.9472222222222223 | 0 |
| 0.9479166666666666 | 0 |
| 0.9486111111111111 | 0 |
| 0.9493055555555556 | 0 |
| 0.9500000000000001 | 0 |
| 0.9506944444444444 | 0 |
| 0.9513888888888888 | 0 |
| 0.9520833333333334 | 0 |
| 0.9527777777777778 | 0 |
| 0.9534722222222222 | 0 |
| 0.9541666666666666 | 0 |
| 0.9548611111111112 | 0 |
| 0.9555555555555556 | 0 |
| 0.9562499999999999 | 0 |
| 0.9569444444444444 | 0 |
| 0.9576388888888889 | 0 |
| 0.9583333333333334 | 0 |
| 0.9590277777777777 | 0 |
| 0.9597222222222223 | 0 |
| 0.9604166666666667 | 0 |
| 0.9611111111111111 | 0 |
| 0.9618055555555555 | 0 |
| 0.9625 | 0 |
| 0.9631944444444445 | 0 |
| 0.9638888888888889 | 0 |
| 0.9645833333333332 | 0 |
| 0.9652777777777778 | 0 |
| 0.9659722222222222 | 0 |
| 0.9666666666666667 | 0 |
| 0.967361111111111 | 0 |
| 0.9680555555555556 | 0 |
| 0.96875 | 0 |
| 0.9694444444444444 | 0 |
| 0.970138888888889 | 0 |
| 0.9708333333333333 | 0 |
| 0.9715277777777778 | 0 |
| 0.9722222222222222 | 0 |
| 0.9729166666666668 | 0 |
| 0.9736111111111111 | 0 |
| 0.9743055555555555 | 0 |
| 0.975 | 0 |
| 0.9756944444444445 | 0 |
| 0.9763888888888889 | 0 |
| 0.9770833333333333 | 0 |
| 0.9777777777777777 | 0 |
| 0.9784722222222223 | 0 |
| 0.9791666666666666 | 0 |
| 0.9798611111111111 | 0 |
| 0.9805555555555556 | 0 |
| 0.9812500000000001 | 0 |
| 0.9819444444444444 | 0 |
| 0.9826388888888888 | 0 |
| 0.9833333333333334 | 0 |
| 0.9840277777777778 | 0 |
| 0.9847222222222222 | 0 |
| 0.9854166666666666 | 0 |
| 0.9861111111111112 | 0 |
| 0.9868055555555556 | 0 |
| 0.9874999999999999 | 0 |
| 0.9881944444444444 | 0 |
| 0.9888888888888889 | 0 |
| 0.9895833333333334 | 0 |
| 0.9902777777777777 | 0 |
| 0.9909722222222223 | 0 |
| 0.9916666666666667 | 0 |
| 0.9923611111111111 | 0 |
| 0.9930555555555555 | 0 |
| 0.99375 | 0 |
| 0.9944444444444445 | 0 |
| 0.9951388888888889 | 0 |
| 0.9958333333333332 | 0 |
| 0.9965277777777778 | 0 |
| 0.9972222222222222 | 0 |
| 0.9979166666666667 | 0 |
| 0.998611111111111 | 0 |
| 0.9993055555555556 | 0 |